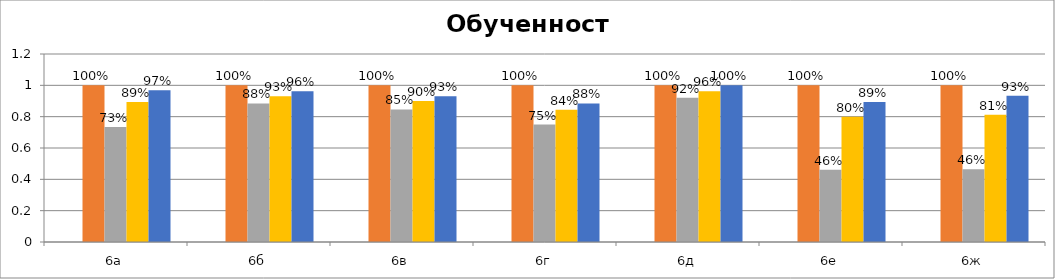
| Category | Series 0 | Series 1 | Series 2 | Series 3 | Series 4 |
|---|---|---|---|---|---|
| 6а |  | 1 | 0.733 | 0.893 | 0.969 |
| 6б |  | 1 | 0.885 | 0.931 | 0.963 |
| 6в |  | 1 | 0.846 | 0.9 | 0.931 |
| 6г |  | 1 | 0.75 | 0.844 | 0.885 |
| 6д |  | 1 | 0.92 | 0.962 | 1 |
| 6е |  | 1 | 0.462 | 0.8 | 0.893 |
| 6ж |  | 1 | 0.464 | 0.812 | 0.933 |